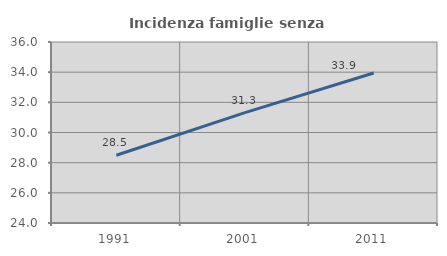
| Category | Incidenza famiglie senza nuclei |
|---|---|
| 1991.0 | 28.492 |
| 2001.0 | 31.315 |
| 2011.0 | 33.945 |